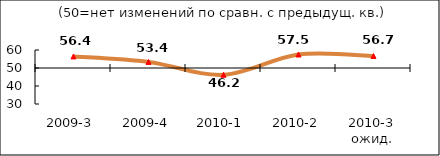
| Category | Диф.индекс ↓ |
|---|---|
| 2009-3 | 56.415 |
| 2009-4 | 53.385 |
| 2010-1 | 46.225 |
| 2010-2 | 57.5 |
| 2010-3 ожид. | 56.67 |